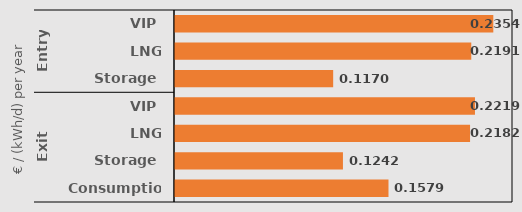
| Category | Series 0 |
|---|---|
| 0 | 0.235 |
| 1 | 0.219 |
| 2 | 0.117 |
| 3 | 0.222 |
| 4 | 0.218 |
| 5 | 0.124 |
| 6 | 0.158 |